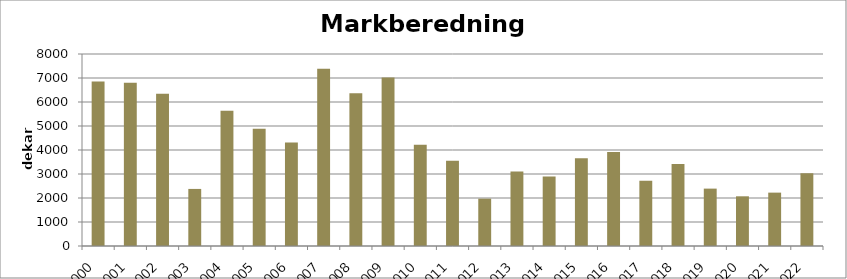
| Category | Totalt |
|---|---|
| 2000 | 6854 |
| 2001 | 6799 |
| 2002 | 6345 |
| 2003 | 2378 |
| 2004 | 5637 |
| 2005 | 4888 |
| 2006 | 4313 |
| 2007 | 7386 |
| 2008 | 6365 |
| 2009 | 7018 |
| 2010 | 4223 |
| 2011 | 3551 |
| 2012 | 1972 |
| 2013 | 3101 |
| 2014 | 2894 |
| 2015 | 3660 |
| 2016 | 3916 |
| 2017 | 2714 |
| 2018 | 3416 |
| 2019 | 2391 |
| 2020 | 2071 |
| 2021 | 2224 |
| 2022 | 3028 |